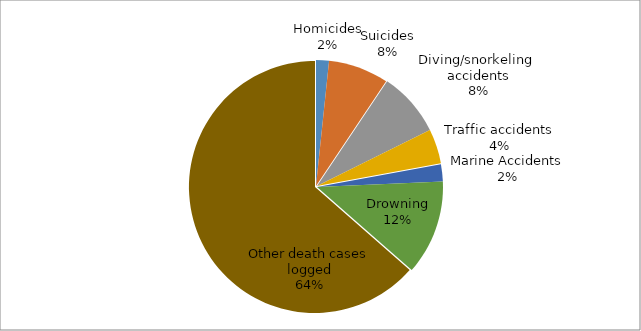
| Category | Series 0 |
|---|---|
| Homicides | 3 |
| Suicides | 14 |
| Diving/snorkeling  accidents | 15 |
| Traffic accidents | 8 |
| Marine Accidents | 4 |
| Drowning | 22 |
| Other death cases logged | 115 |